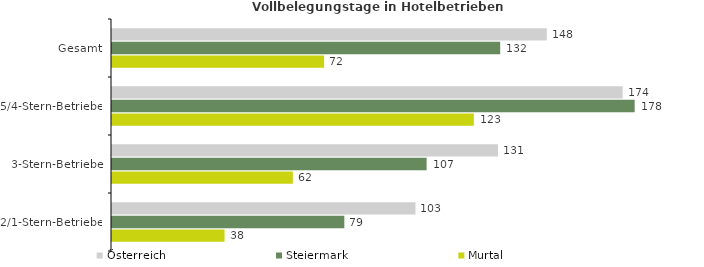
| Category | Österreich | Steiermark | Murtal |
|---|---|---|---|
| Gesamt | 147.876 | 132.038 | 72.147 |
| 5/4-Stern-Betriebe | 173.697 | 177.779 | 123.064 |
| 3-Stern-Betriebe | 131.294 | 107.011 | 61.51 |
| 2/1-Stern-Betriebe | 103.222 | 79.024 | 38.288 |